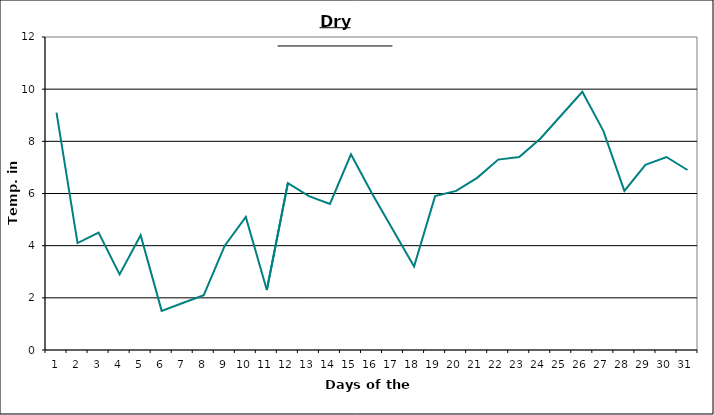
| Category | Series 0 |
|---|---|
| 0 | 9.1 |
| 1 | 4.1 |
| 2 | 4.5 |
| 3 | 2.9 |
| 4 | 4.4 |
| 5 | 1.5 |
| 6 | 1.8 |
| 7 | 2.1 |
| 8 | 4 |
| 9 | 5.1 |
| 10 | 2.3 |
| 11 | 6.4 |
| 12 | 5.9 |
| 13 | 5.6 |
| 14 | 7.5 |
| 15 | 6 |
| 16 | 4.6 |
| 17 | 3.2 |
| 18 | 5.9 |
| 19 | 6.1 |
| 20 | 6.6 |
| 21 | 7.3 |
| 22 | 7.4 |
| 23 | 8.1 |
| 24 | 9 |
| 25 | 9.9 |
| 26 | 8.4 |
| 27 | 6.1 |
| 28 | 7.1 |
| 29 | 7.4 |
| 30 | 6.9 |